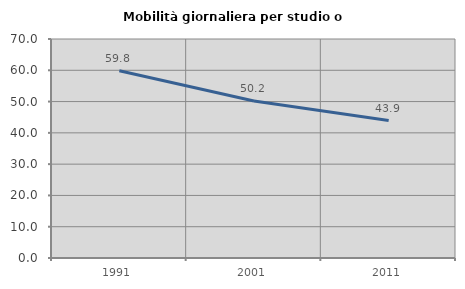
| Category | Mobilità giornaliera per studio o lavoro |
|---|---|
| 1991.0 | 59.834 |
| 2001.0 | 50.202 |
| 2011.0 | 43.946 |